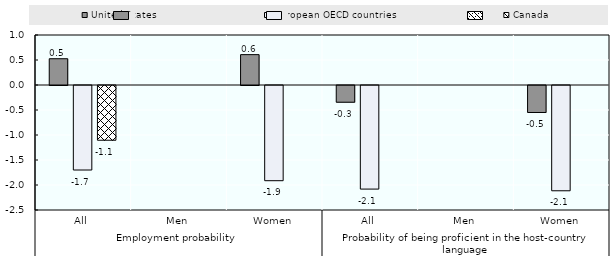
| Category | United States | European OECD countries | Canada |
|---|---|---|---|
| 0 | 0.526 | -1.69 | -1.095 |
| 1 | 0 | 0 | 0 |
| 2 | 0.607 | -1.904 | 0 |
| 3 | -0.335 | -2.072 | 0 |
| 4 | 0 | 0 | 0 |
| 5 | -0.54 | -2.105 | 0 |